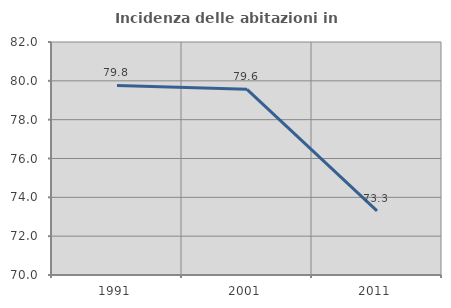
| Category | Incidenza delle abitazioni in proprietà  |
|---|---|
| 1991.0 | 79.765 |
| 2001.0 | 79.564 |
| 2011.0 | 73.299 |